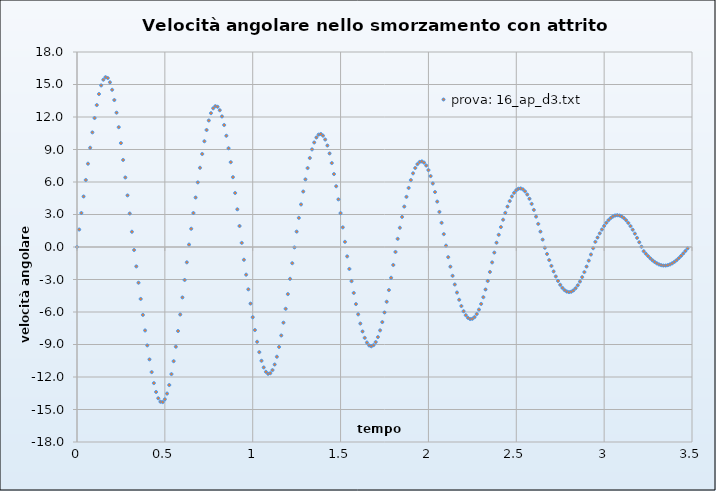
| Category | prova: 16_ap_d3.txt |
|---|---|
| 0.0 | 0 |
| 0.012500000000000067 | 1.612 |
| 0.025000000000000022 | 3.138 |
| 0.03749999999999998 | 4.664 |
| 0.050000000000000044 | 6.184 |
| 0.0625 | 7.69 |
| 0.07500000000000007 | 9.163 |
| 0.08750000000000002 | 10.58 |
| 0.09999999999999998 | 11.906 |
| 0.11250000000000004 | 13.101 |
| 0.125 | 14.12 |
| 0.13750000000000007 | 14.915 |
| 0.15000000000000002 | 15.445 |
| 0.16249999999999998 | 15.677 |
| 0.17500000000000004 | 15.595 |
| 0.1875 | 15.201 |
| 0.20000000000000007 | 14.512 |
| 0.21250000000000002 | 13.564 |
| 0.22499999999999998 | 12.397 |
| 0.23750000000000004 | 11.059 |
| 0.25 | 9.592 |
| 0.26250000000000007 | 8.034 |
| 0.275 | 6.418 |
| 0.2875 | 4.765 |
| 0.30000000000000004 | 3.091 |
| 0.3125 | 1.408 |
| 0.32500000000000007 | -0.28 |
| 0.3375 | -1.792 |
| 0.35 | -3.299 |
| 0.36250000000000004 | -4.794 |
| 0.375 | -6.267 |
| 0.38750000000000007 | -7.704 |
| 0.4 | -9.083 |
| 0.4125 | -10.376 |
| 0.42499999999999993 | -11.549 |
| 0.4375000000000001 | -12.565 |
| 0.45000000000000007 | -13.382 |
| 0.4625 | -13.965 |
| 0.475 | -14.283 |
| 0.48749999999999993 | -14.317 |
| 0.5000000000000001 | -14.062 |
| 0.5125000000000001 | -13.53 |
| 0.525 | -12.742 |
| 0.5375 | -11.733 |
| 0.5499999999999999 | -10.541 |
| 0.5625000000000001 | -9.203 |
| 0.5750000000000001 | -7.757 |
| 0.5875 | -6.233 |
| 0.6 | -4.656 |
| 0.6124999999999999 | -3.045 |
| 0.6250000000000001 | -1.415 |
| 0.6375000000000001 | 0.222 |
| 0.65 | 1.684 |
| 0.6625 | 3.136 |
| 0.6749999999999999 | 4.567 |
| 0.6875000000000001 | 5.966 |
| 0.7000000000000001 | 7.313 |
| 0.7125 | 8.586 |
| 0.725 | 9.759 |
| 0.7374999999999999 | 10.801 |
| 0.7500000000000001 | 11.676 |
| 0.7625000000000001 | 12.354 |
| 0.775 | 12.803 |
| 0.7875 | 13.003 |
| 0.7999999999999999 | 12.943 |
| 0.8125000000000001 | 12.622 |
| 0.8250000000000001 | 12.054 |
| 0.8375 | 11.259 |
| 0.85 | 10.268 |
| 0.8624999999999999 | 9.114 |
| 0.8750000000000001 | 7.829 |
| 0.8875000000000001 | 6.444 |
| 0.9 | 4.986 |
| 0.9125 | 3.477 |
| 0.9249999999999999 | 1.937 |
| 0.9375000000000001 | 0.38 |
| 0.9500000000000001 | -1.18 |
| 0.9625 | -2.555 |
| 0.975 | -3.908 |
| 0.9874999999999999 | -5.223 |
| 1.0 | -6.483 |
| 1.0125000000000002 | -7.668 |
| 1.025 | -8.751 |
| 1.0375 | -9.706 |
| 1.0499999999999998 | -10.504 |
| 1.0625 | -11.118 |
| 1.0750000000000002 | -11.525 |
| 1.0875 | -11.705 |
| 1.1 | -11.651 |
| 1.1124999999999998 | -11.362 |
| 1.125 | -10.849 |
| 1.1375000000000002 | -10.129 |
| 1.15 | -9.227 |
| 1.1625 | -8.17 |
| 1.1749999999999998 | -6.986 |
| 1.1875 | -5.704 |
| 1.2000000000000002 | -4.347 |
| 1.2125 | -2.938 |
| 1.225 | -1.496 |
| 1.2374999999999998 | -0.037 |
| 1.25 | 1.421 |
| 1.2625000000000002 | 2.69 |
| 1.275 | 3.928 |
| 1.2875 | 5.119 |
| 1.2999999999999998 | 6.245 |
| 1.3125 | 7.284 |
| 1.3250000000000002 | 8.214 |
| 1.3375 | 9.01 |
| 1.35 | 9.648 |
| 1.3624999999999998 | 10.108 |
| 1.375 | 10.372 |
| 1.3875000000000002 | 10.43 |
| 1.4 | 10.278 |
| 1.4125 | 9.919 |
| 1.4249999999999998 | 9.366 |
| 1.4375 | 8.636 |
| 1.4499999999999997 | 7.75 |
| 1.4625 | 6.732 |
| 1.475 | 5.606 |
| 1.4874999999999998 | 4.397 |
| 1.5 | 3.126 |
| 1.5124999999999997 | 1.812 |
| 1.525 | 0.476 |
| 1.5375 | -0.867 |
| 1.5499999999999998 | -2.024 |
| 1.5625 | -3.154 |
| 1.5749999999999997 | -4.242 |
| 1.5875 | -5.269 |
| 1.6 | -6.218 |
| 1.6124999999999998 | -7.067 |
| 1.625 | -7.796 |
| 1.6374999999999997 | -8.386 |
| 1.65 | -8.82 |
| 1.6625 | -9.082 |
| 1.6749999999999998 | -9.163 |
| 1.6875 | -9.06 |
| 1.6999999999999997 | -8.775 |
| 1.7125 | -8.316 |
| 1.725 | -7.695 |
| 1.7374999999999998 | -6.931 |
| 1.75 | -6.043 |
| 1.7624999999999997 | -5.051 |
| 1.775 | -3.977 |
| 1.7875 | -2.841 |
| 1.7999999999999998 | -1.661 |
| 1.8125 | -0.457 |
| 1.8249999999999997 | 0.753 |
| 1.8375 | 1.777 |
| 1.85 | 2.776 |
| 1.8624999999999998 | 3.732 |
| 1.875 | 4.629 |
| 1.8874999999999997 | 5.451 |
| 1.9 | 6.181 |
| 1.9125 | 6.8 |
| 1.9249999999999998 | 7.294 |
| 1.9375 | 7.648 |
| 1.9499999999999997 | 7.852 |
| 1.9625 | 7.899 |
| 1.975 | 7.787 |
| 1.9874999999999998 | 7.519 |
| 2.0 | 7.1 |
| 2.0124999999999997 | 6.543 |
| 2.025 | 5.862 |
| 2.0375 | 5.072 |
| 2.05 | 4.192 |
| 2.0625 | 3.239 |
| 2.0749999999999997 | 2.231 |
| 2.0875 | 1.188 |
| 2.1 | 0.124 |
| 2.1125 | -0.941 |
| 2.125 | -1.816 |
| 2.1374999999999997 | -2.661 |
| 2.15 | -3.462 |
| 2.1625 | -4.204 |
| 2.175 | -4.872 |
| 2.1875 | -5.452 |
| 2.1999999999999997 | -5.93 |
| 2.2125 | -6.295 |
| 2.225 | -6.537 |
| 2.2375 | -6.648 |
| 2.25 | -6.627 |
| 2.2624999999999997 | -6.471 |
| 2.275 | -6.186 |
| 2.2875 | -5.777 |
| 2.3 | -5.255 |
| 2.3125 | -4.632 |
| 2.3249999999999997 | -3.922 |
| 2.3375 | -3.14 |
| 2.35 | -2.301 |
| 2.3625 | -1.421 |
| 2.375 | -0.517 |
| 2.3874999999999997 | 0.397 |
| 2.4 | 1.128 |
| 2.4125 | 1.84 |
| 2.425 | 2.52 |
| 2.4375 | 3.154 |
| 2.4499999999999997 | 3.731 |
| 2.4625 | 4.239 |
| 2.475 | 4.666 |
| 2.4875 | 5.003 |
| 2.5 | 5.243 |
| 2.5124999999999997 | 5.378 |
| 2.525 | 5.405 |
| 2.5375 | 5.323 |
| 2.55 | 5.134 |
| 2.5625 | 4.842 |
| 2.5749999999999997 | 4.454 |
| 2.5875 | 3.978 |
| 2.6 | 3.424 |
| 2.6125 | 2.805 |
| 2.625 | 2.132 |
| 2.6374999999999997 | 1.42 |
| 2.65 | 0.682 |
| 2.6625 | -0.069 |
| 2.675 | -0.644 |
| 2.6875 | -1.207 |
| 2.6999999999999997 | -1.747 |
| 2.7125 | -2.255 |
| 2.725 | -2.721 |
| 2.7375 | -3.134 |
| 2.75 | -3.488 |
| 2.7624999999999997 | -3.773 |
| 2.775 | -3.983 |
| 2.7875 | -4.115 |
| 2.8 | -4.164 |
| 2.8125 | -4.129 |
| 2.8249999999999997 | -4.01 |
| 2.8375 | -3.811 |
| 2.85 | -3.536 |
| 2.8625 | -3.19 |
| 2.875 | -2.78 |
| 2.8874999999999997 | -2.316 |
| 2.9 | -1.807 |
| 2.9125 | -1.262 |
| 2.925 | -0.693 |
| 2.9375 | -0.111 |
| 2.9499999999999997 | 0.473 |
| 2.9625 | 0.873 |
| 2.975 | 1.257 |
| 2.9875 | 1.616 |
| 3.0 | 1.944 |
| 3.0124999999999997 | 2.233 |
| 3.025 | 2.479 |
| 3.0375 | 2.676 |
| 3.05 | 2.819 |
| 3.0625 | 2.906 |
| 3.0749999999999997 | 2.935 |
| 3.0875 | 2.904 |
| 3.1 | 2.815 |
| 3.1125 | 2.669 |
| 3.125 | 2.47 |
| 3.1374999999999997 | 2.221 |
| 3.15 | 1.927 |
| 3.1625 | 1.595 |
| 3.175 | 1.231 |
| 3.1875 | 0.843 |
| 3.1999999999999997 | 0.438 |
| 3.2125 | 0.024 |
| 3.225 | -0.39 |
| 3.2375 | -0.622 |
| 3.25 | -0.841 |
| 3.2624999999999997 | -1.043 |
| 3.275 | -1.225 |
| 3.2875 | -1.382 |
| 3.3 | -1.512 |
| 3.3125 | -1.612 |
| 3.3249999999999997 | -1.679 |
| 3.3375 | -1.712 |
| 3.35 | -1.711 |
| 3.3625 | -1.676 |
| 3.375 | -1.606 |
| 3.3874999999999997 | -1.505 |
| 3.4 | -1.373 |
| 3.4125 | -1.213 |
| 3.4250000000000003 | -1.029 |
| 3.4374999999999996 | -0.824 |
| 3.4499999999999997 | -0.603 |
| 3.4625 | -0.369 |
| 3.475 | -0.128 |